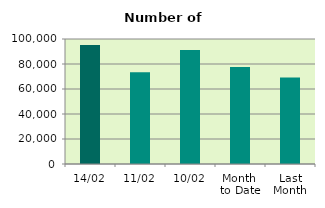
| Category | Series 0 |
|---|---|
| 14/02 | 95146 |
| 11/02 | 73366 |
| 10/02 | 91258 |
| Month 
to Date | 77628 |
| Last
Month | 69227.8 |